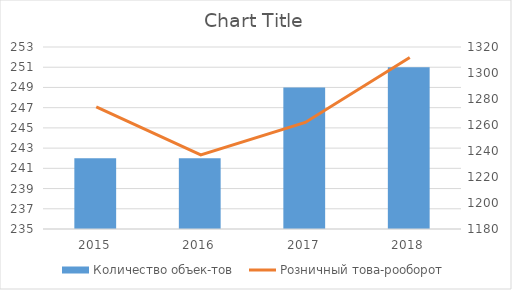
| Category | Количество объек­тов  |
|---|---|
| 2015.0 | 242 |
| 2016.0 | 242 |
| 2017.0 | 249 |
| 2018.0 | 251 |